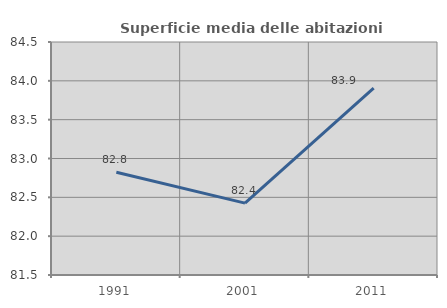
| Category | Superficie media delle abitazioni occupate |
|---|---|
| 1991.0 | 82.823 |
| 2001.0 | 82.425 |
| 2011.0 | 83.907 |